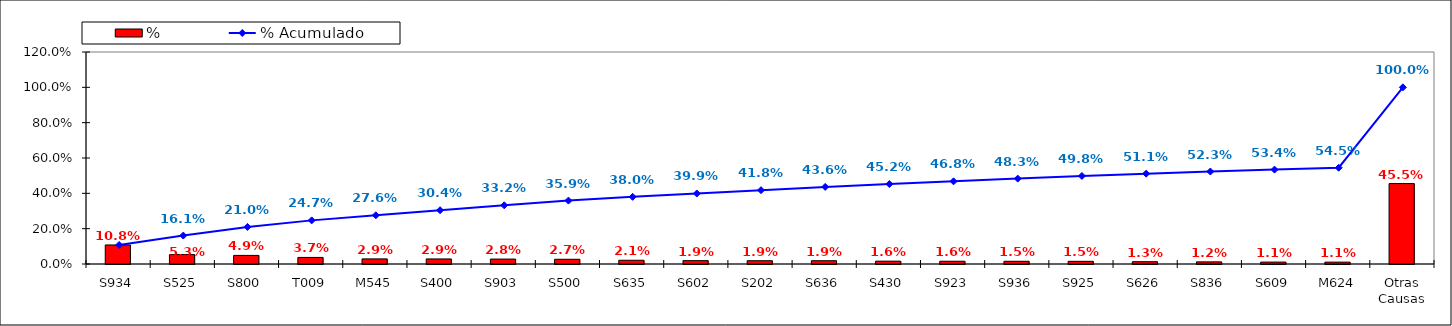
| Category | % |
|---|---|
| S934 | 0.108 |
| S525 | 0.053 |
| S800 | 0.049 |
| T009 | 0.037 |
| M545 | 0.029 |
| S400 | 0.029 |
| S903 | 0.028 |
| S500 | 0.027 |
| S635 | 0.021 |
| S602 | 0.019 |
| S202 | 0.019 |
| S636 | 0.019 |
| S430 | 0.016 |
| S923 | 0.016 |
| S936 | 0.015 |
| S925 | 0.015 |
| S626 | 0.013 |
| S836 | 0.012 |
| S609 | 0.011 |
| M624 | 0.011 |
| Otras Causas | 0.455 |